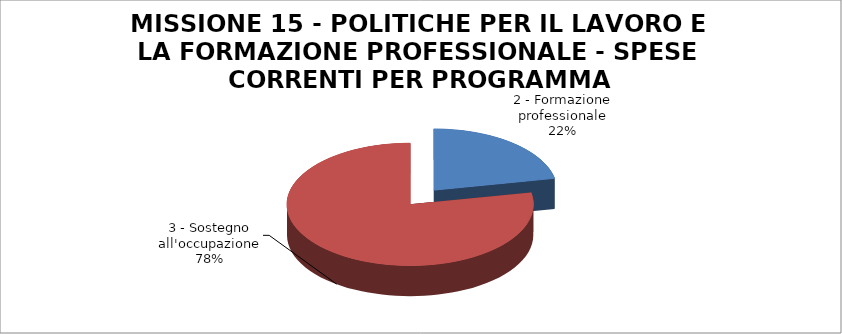
| Category | Series 0 |
|---|---|
| 2 - Formazione professionale | 27000 |
| 3 - Sostegno all'occupazione | 96255 |